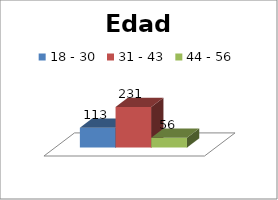
| Category | 18 - 30 | 31 - 43 | 44 - 56 |
|---|---|---|---|
| 0 | 113 | 231 | 56 |